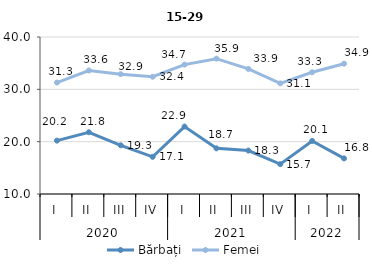
| Category | Bărbați | Femei |
|---|---|---|
| 0 | 20.2 | 31.3 |
| 1 | 21.8 | 33.6 |
| 2 | 19.3 | 32.9 |
| 3 | 17.1 | 32.4 |
| 4 | 22.886 | 34.731 |
| 5 | 18.722 | 35.856 |
| 6 | 18.3 | 33.9 |
| 7 | 15.71 | 31.142 |
| 8 | 20.142 | 33.259 |
| 9 | 16.8 | 34.9 |